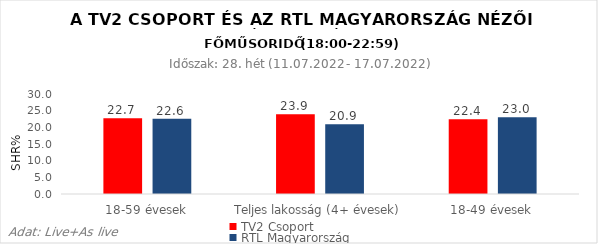
| Category | TV2 Csoport | RTL Magyarország |
|---|---|---|
| 18-59 évesek | 22.7 | 22.6 |
| Teljes lakosság (4+ évesek) | 23.9 | 20.9 |
| 18-49 évesek | 22.4 | 23 |